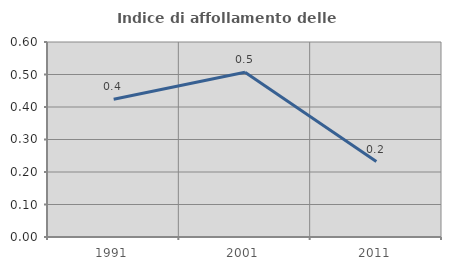
| Category | Indice di affollamento delle abitazioni  |
|---|---|
| 1991.0 | 0.424 |
| 2001.0 | 0.507 |
| 2011.0 | 0.232 |